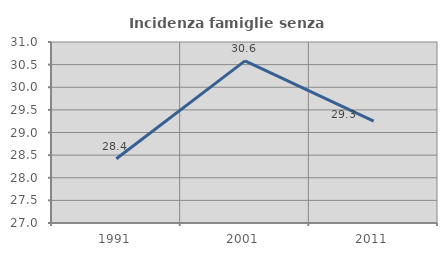
| Category | Incidenza famiglie senza nuclei |
|---|---|
| 1991.0 | 28.42 |
| 2001.0 | 30.584 |
| 2011.0 | 29.251 |